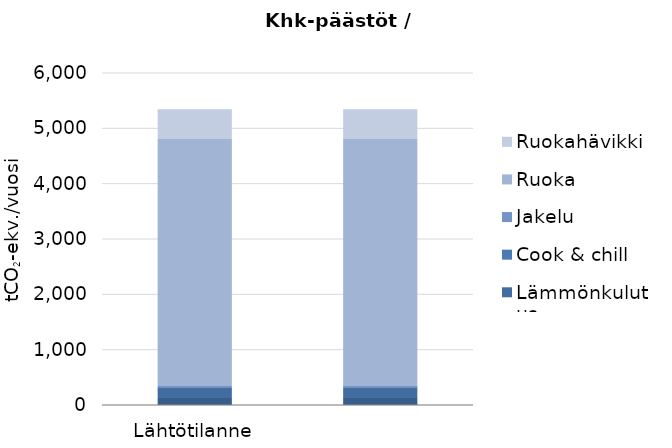
| Category | Sähkönkulutus | Lämmönkulutus | Cook & chill | Jakelu | Ruoka | Ruokahävikki |
|---|---|---|---|---|---|---|
| Lähtötilanne | 125.137 | 196.52 | 0 | 21.308 | 4465.475 | 535.857 |